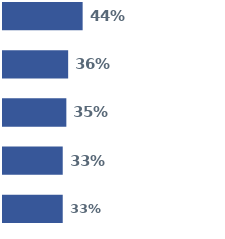
| Category | Series 0 | Series 1 | Series 2 | Series 3 | Series 4 |
|---|---|---|---|---|---|
| 0 | 0.44 | 0.36 | 0.35 | 0.33 | 0.33 |